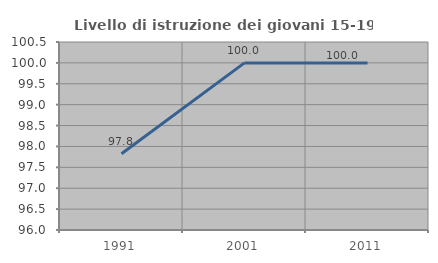
| Category | Livello di istruzione dei giovani 15-19 anni |
|---|---|
| 1991.0 | 97.826 |
| 2001.0 | 100 |
| 2011.0 | 100 |